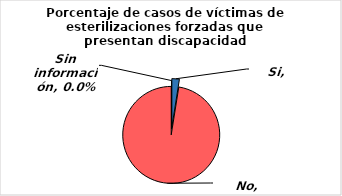
| Category | Series 0 |
|---|---|
| Si | 0.025 |
| No | 0.975 |
| Sin información | 0 |